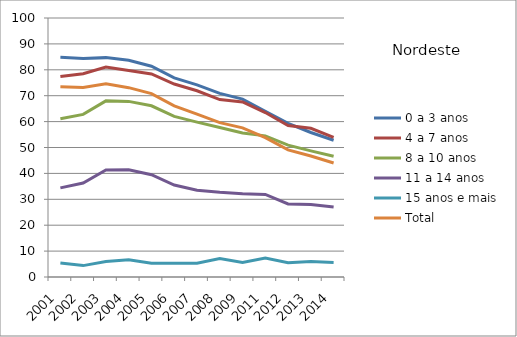
| Category | 0 a 3 anos | 4 a 7 anos | 8 a 10 anos | 11 a 14 anos | 15 anos e mais | Total |
|---|---|---|---|---|---|---|
| 2001.0 | 84.8 | 77.4 | 61.1 | 34.4 | 5.4 | 73.5 |
| 2002.0 | 84.4 | 78.5 | 62.8 | 36.3 | 4.4 | 73.2 |
| 2003.0 | 84.7 | 81.1 | 68 | 41.3 | 6 | 74.6 |
| 2004.0 | 83.7 | 79.7 | 67.8 | 41.4 | 6.7 | 73.1 |
| 2005.0 | 81.4 | 78.4 | 66.1 | 39.5 | 5.3 | 70.8 |
| 2006.0 | 76.9 | 74.5 | 62 | 35.5 | 5.3 | 66.1 |
| 2007.0 | 74.2 | 71.9 | 59.8 | 33.5 | 5.3 | 62.9 |
| 2008.0 | 70.9 | 68.5 | 57.7 | 32.7 | 7.1 | 59.6 |
| 2009.0 | 68.7 | 67.6 | 55.6 | 32.1 | 5.6 | 57.6 |
| 2011.0 | 64 | 63.5 | 54.5 | 31.9 | 7.3 | 53.8 |
| 2012.0 | 59.3 | 58.5 | 50.9 | 28.2 | 5.5 | 49.1 |
| 2013.0 | 55.8 | 57.4 | 48.7 | 28 | 6 | 46.7 |
| 2014.0 | 52.8 | 53.9 | 46.6 | 27 | 5.6 | 44 |